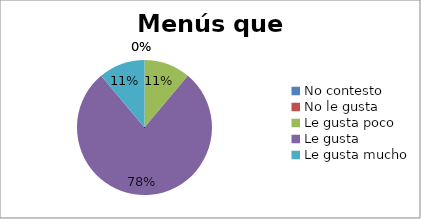
| Category | Series 0 |
|---|---|
| No contesto | 0 |
| No le gusta | 0 |
| Le gusta poco | 1 |
| Le gusta | 7 |
| Le gusta mucho | 1 |